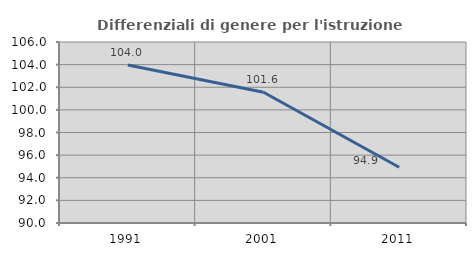
| Category | Differenziali di genere per l'istruzione superiore |
|---|---|
| 1991.0 | 103.961 |
| 2001.0 | 101.559 |
| 2011.0 | 94.928 |